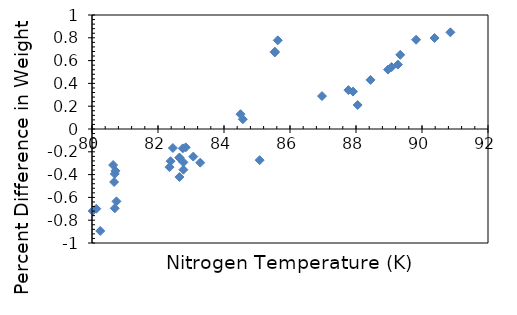
| Category | Series 0 |
|---|---|
| 85.54 | 0.671 |
| 85.54 | 0.678 |
| 85.63 | 0.778 |
| 85.08 | -0.273 |
| 84.5 | 0.13 |
| 84.57 | 0.086 |
| 89.08 | 0.544 |
| 89.27 | 0.565 |
| 89.34 | 0.651 |
| 89.82 | 0.783 |
| 90.38 | 0.798 |
| 90.86 | 0.848 |
| 80.25 | -0.895 |
| 80.02 | -0.719 |
| 80.13 | -0.699 |
| 80.69 | -0.696 |
| 80.67 | -0.465 |
| 80.69 | -0.394 |
| 80.74 | -0.635 |
| 80.71 | -0.367 |
| 80.64 | -0.316 |
| 86.97 | 0.289 |
| 87.77 | 0.341 |
| 87.91 | 0.328 |
| 88.05 | 0.21 |
| 88.44 | 0.431 |
| 88.97 | 0.521 |
| 83.28 | -0.295 |
| 83.07 | -0.242 |
| 82.84 | -0.161 |
| 82.65 | -0.254 |
| 82.77 | -0.357 |
| 82.77 | -0.292 |
| 82.65 | -0.421 |
| 82.35 | -0.335 |
| 82.65 | -0.25 |
| 82.38 | -0.283 |
| 82.45 | -0.167 |
| 82.75 | -0.17 |